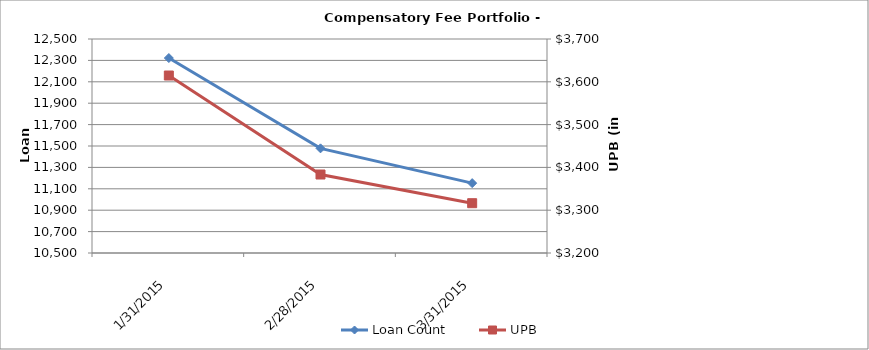
| Category | Loan Count |
|---|---|
| 1/31/15 | 12322 |
| 2/28/15 | 11478 |
| 3/31/15 | 11153 |